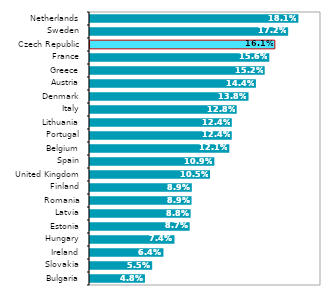
| Category | 2016 |
|---|---|
| Bulgaria | 0.048 |
| Slovakia | 0.055 |
| Ireland | 0.064 |
| Hungary | 0.074 |
| Estonia | 0.087 |
| Latvia | 0.088 |
| Romania | 0.089 |
| Finland | 0.089 |
| United Kingdom | 0.105 |
| Spain | 0.109 |
| Belgium | 0.121 |
| Portugal | 0.124 |
| Lithuania | 0.124 |
| Italy | 0.128 |
| Denmark | 0.138 |
| Austria | 0.144 |
| Greece | 0.152 |
| France | 0.156 |
| Czech Republic | 0.161 |
| Sweden | 0.172 |
| Netherlands | 0.181 |